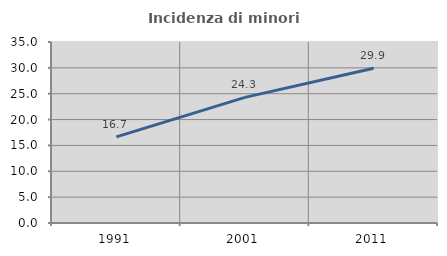
| Category | Incidenza di minori stranieri |
|---|---|
| 1991.0 | 16.667 |
| 2001.0 | 24.299 |
| 2011.0 | 29.93 |